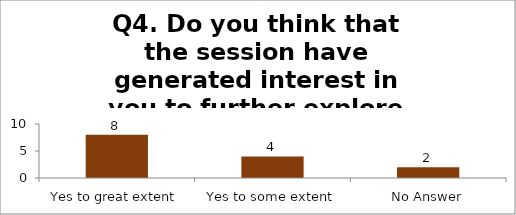
| Category | Q4. Do you think that the session have generated interest in you to further explore the topics? |
|---|---|
| Yes to great extent | 8 |
| Yes to some extent | 4 |
| No Answer | 2 |